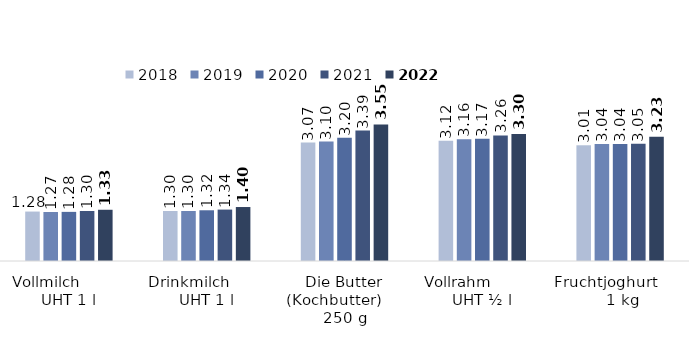
| Category | 2018 | 2019 | 2020 | 2021 | 2022 |
|---|---|---|---|---|---|
| Vollmilch          UHT 1 l | 1.284 | 1.273 | 1.276 | 1.298 | 1.331 |
| Drinkmilch        UHT 1 l | 1.3 | 1.299 | 1.318 | 1.336 | 1.402 |
| Die Butter (Kochbutter)     250 g | 3.075 | 3.101 | 3.2 | 3.386 | 3.546 |
| Vollrahm           UHT ½ l | 3.121 | 3.163 | 3.173 | 3.262 | 3.297 |
| Fruchtjoghurt        1 kg | 3.008 | 3.042 | 3.041 | 3.046 | 3.229 |